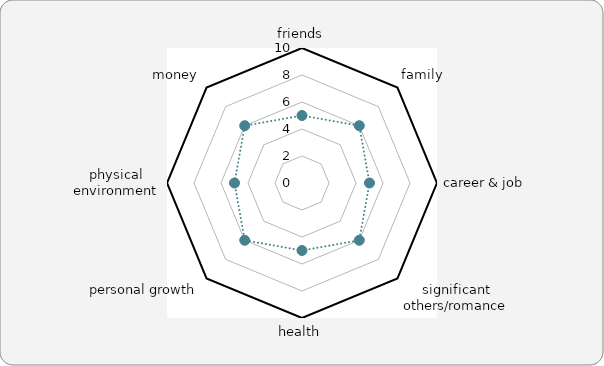
| Category |  fill in the values from 1 - 10 here | in a perfect world |
|---|---|---|
| friends | 5 | 10 |
| family | 6 | 10 |
| career & job | 5 | 10 |
| significant others/romance | 6 | 10 |
| health | 5 | 10 |
| personal growth | 6 | 10 |
| physical environment | 5 | 10 |
| money | 6 | 10 |